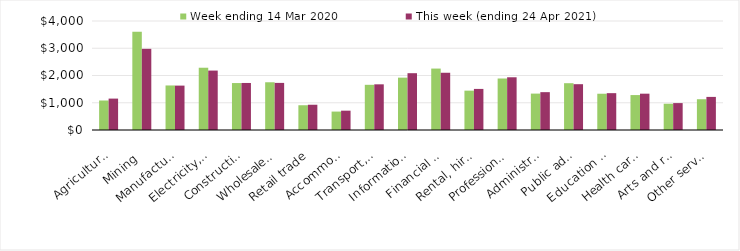
| Category | Week ending 14 Mar 2020 | This week (ending 24 Apr 2021) |
|---|---|---|
| Agriculture, forestry and fishing | 1082.64 | 1152.41 |
| Mining | 3610.03 | 2978.56 |
| Manufacturing | 1634.41 | 1629.12 |
| Electricity, gas, water and waste services | 2285.08 | 2180.72 |
| Construction | 1723.02 | 1725.97 |
| Wholesale trade | 1751.85 | 1728.38 |
| Retail trade | 908.75 | 926.99 |
| Accommodation and food services | 676.14 | 709.26 |
| Transport, postal and warehousing | 1658.09 | 1676.01 |
| Information media and telecommunications | 1921.27 | 2084.67 |
| Financial and insurance services | 2254.35 | 2100.64 |
| Rental, hiring and real estate services | 1444.07 | 1507.63 |
| Professional, scientific and technical services | 1889.82 | 1934.81 |
| Administrative and support services | 1335.9 | 1388.85 |
| Public administration and safety | 1717.46 | 1681.2 |
| Education and training | 1330.94 | 1352.1 |
| Health care and social assistance | 1282.05 | 1332.86 |
| Arts and recreation services | 964.13 | 987.49 |
| Other services | 1129.25 | 1214.7 |